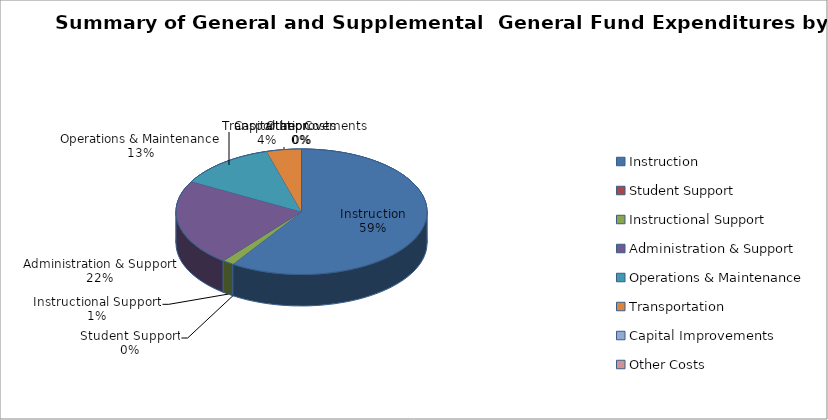
| Category | 2018-2019 |
|---|---|
| Instruction | 1277872 |
| Student Support | 0 |
| Instructional Support | 32270 |
| Administration & Support | 481559 |
| Operations & Maintenance | 270350 |
| Transportation | 96305 |
| Capital Improvements | 0 |
| Other Costs | 0 |